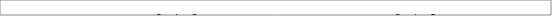
| Category | Series 3 | Series 0 |
|---|---|---|
| 0 | 1 | 1 |